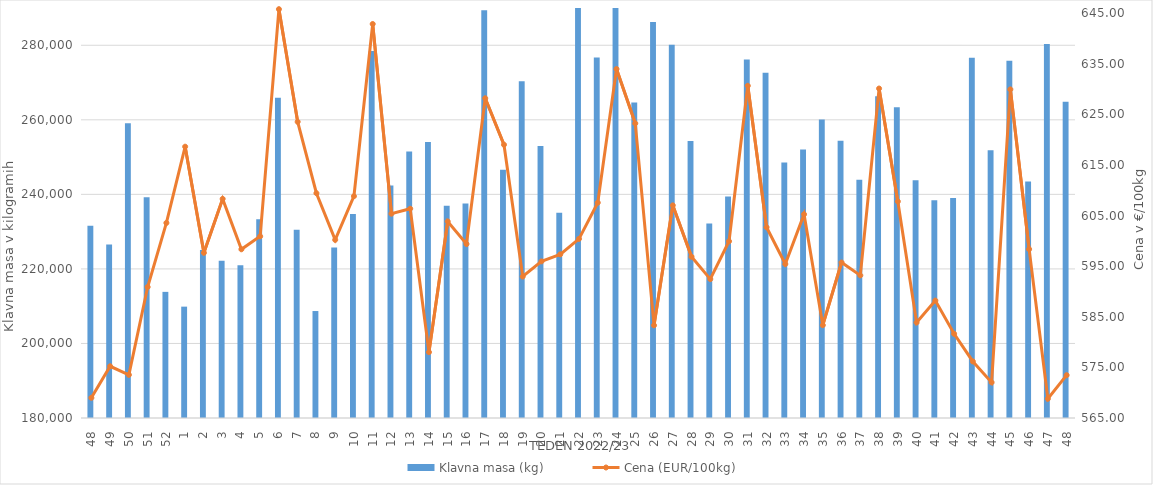
| Category | Klavna masa (kg) |
|---|---|
| 48.0 | 231565 |
| 49.0 | 226575 |
| 50.0 | 259073 |
| 51.0 | 239211 |
| 52.0 | 213841 |
| 1.0 | 209877 |
| 2.0 | 225045 |
| 3.0 | 222198 |
| 4.0 | 221002 |
| 5.0 | 233306 |
| 6.0 | 265944 |
| 7.0 | 230531 |
| 8.0 | 208699 |
| 9.0 | 225712 |
| 10.0 | 234762 |
| 11.0 | 278467 |
| 12.0 | 242369 |
| 13.0 | 251507 |
| 14.0 | 254072 |
| 15.0 | 236964 |
| 16.0 | 237552 |
| 17.0 | 289400 |
| 18.0 | 246616 |
| 19.0 | 270374 |
| 20.0 | 252984 |
| 21.0 | 235060 |
| 22.0 | 290816 |
| 23.0 | 276702 |
| 24.0 | 292976 |
| 25.0 | 264669 |
| 26.0 | 286237 |
| 27.0 | 280112 |
| 28.0 | 254336 |
| 29.0 | 232178 |
| 30.0 | 239437 |
| 31.0 | 276163 |
| 32.0 | 272647 |
| 33.0 | 248536 |
| 34.0 | 252050 |
| 35.0 | 260110 |
| 36.0 | 254389 |
| 37.0 | 243933 |
| 38.0 | 266321 |
| 39.0 | 263346 |
| 40.0 | 243765 |
| 41.0 | 238404 |
| 42.0 | 239007 |
| 43.0 | 276684 |
| 44.0 | 251832 |
| 45.0 | 275816 |
| 46.0 | 243425 |
| 47.0 | 280350 |
| 48.0 | 264849 |